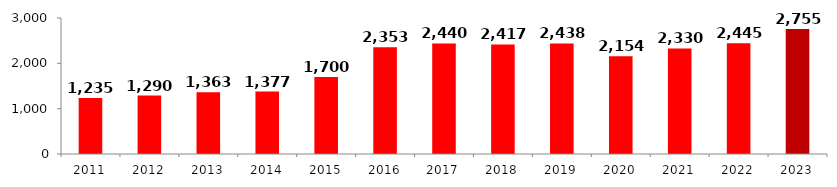
| Category | Series 0 |
|---|---|
| 2011.0 | 1235.345 |
| 2012.0 | 1289.917 |
| 2013.0 | 1363.453 |
| 2014.0 | 1377.374 |
| 2015.0 | 1699.94 |
| 2016.0 | 2352.96 |
| 2017.0 | 2440.181 |
| 2018.0 | 2416.881 |
| 2019.0 | 2437.925 |
| 2020.0 | 2153.952 |
| 2021.0 | 2329.886 |
| 2022.0 | 2445.271 |
| 2023.0 | 2755.066 |